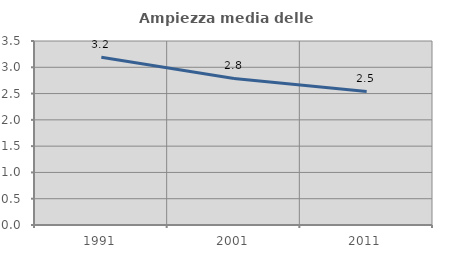
| Category | Ampiezza media delle famiglie |
|---|---|
| 1991.0 | 3.189 |
| 2001.0 | 2.787 |
| 2011.0 | 2.541 |